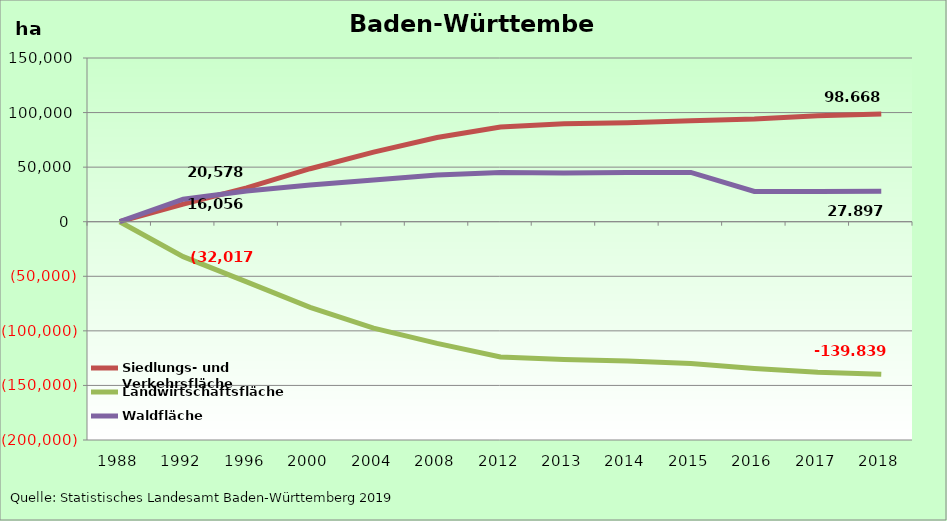
| Category | Siedlungs- und Verkehrsfläche | Landwirtschaftsfläche | Waldfläche |
|---|---|---|---|
| 1988.0 | 0 | 0 | 0 |
| 1992.0 | 16056 | -32017 | 20578 |
| 1996.0 | 31010 | -55135 | 28116 |
| 2000.0 | 48548 | -78485 | 33617 |
| 2004.0 | 63708 | -97463 | 38208 |
| 2008.0 | 77102 | -111434 | 42768 |
| 2012.0 | 86859 | -123874 | 45176 |
| 2013.0 | 89660 | -126199 | 44689 |
| 2014.0 | 90700 | -127678 | 45015 |
| 2015.0 | 92599 | -129904 | 45159 |
| 2016.0 | 94150 | -134469 | 27747 |
| 2017.0 | 97017 | -137860 | 27697 |
| 2018.0 | 98668 | -139839 | 27897 |